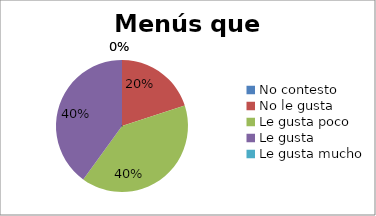
| Category | Series 0 |
|---|---|
| No contesto | 0 |
| No le gusta | 1 |
| Le gusta poco | 2 |
| Le gusta | 2 |
| Le gusta mucho | 0 |